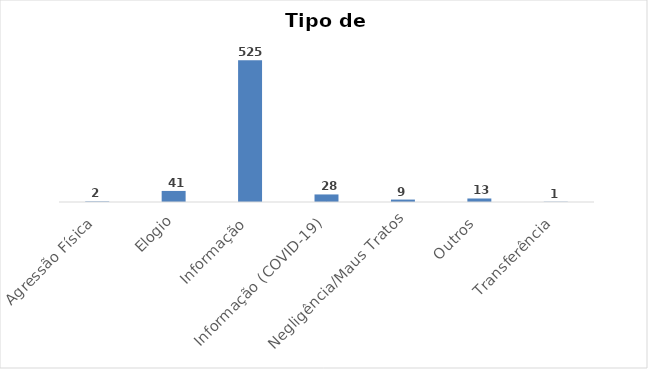
| Category | TOTAL  |
|---|---|
| Agressão Física | 2 |
| Elogio | 41 |
| Informação | 525 |
| Informação (COVID-19) | 28 |
| Negligência/Maus Tratos | 9 |
| Outros | 13 |
| Transferência | 1 |